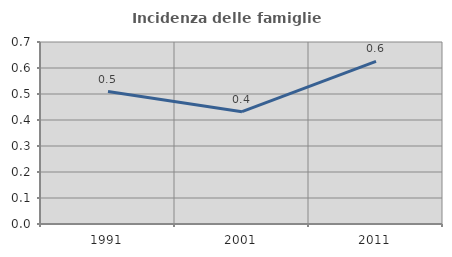
| Category | Incidenza delle famiglie numerose |
|---|---|
| 1991.0 | 0.509 |
| 2001.0 | 0.432 |
| 2011.0 | 0.625 |